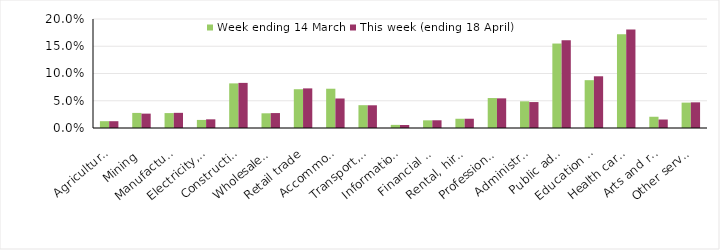
| Category | Week ending 14 March | This week (ending 18 April) |
|---|---|---|
| Agriculture, forestry and fishing | 0.013 | 0.012 |
| Mining | 0.028 | 0.026 |
| Manufacturing | 0.027 | 0.028 |
| Electricity, gas, water and waste services | 0.015 | 0.016 |
| Construction | 0.082 | 0.083 |
| Wholesale trade | 0.027 | 0.027 |
| Retail trade | 0.071 | 0.073 |
| Accommodation and food services | 0.072 | 0.054 |
| Transport, postal and warehousing | 0.042 | 0.042 |
| Information media and telecommunications | 0.006 | 0.006 |
| Financial and insurance services | 0.014 | 0.014 |
| Rental, hiring and real estate services | 0.017 | 0.017 |
| Professional, scientific and technical services | 0.055 | 0.054 |
| Administrative and support services | 0.049 | 0.048 |
| Public administration and safety | 0.155 | 0.161 |
| Education and training | 0.088 | 0.095 |
| Health care and social assistance | 0.172 | 0.181 |
| Arts and recreation services | 0.021 | 0.016 |
| Other services | 0.047 | 0.047 |